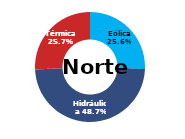
| Category | Norte |
|---|---|
| Eólica | 91.007 |
| Hidráulica | 173.296 |
| Solar | 0 |
| Térmica | 91.392 |